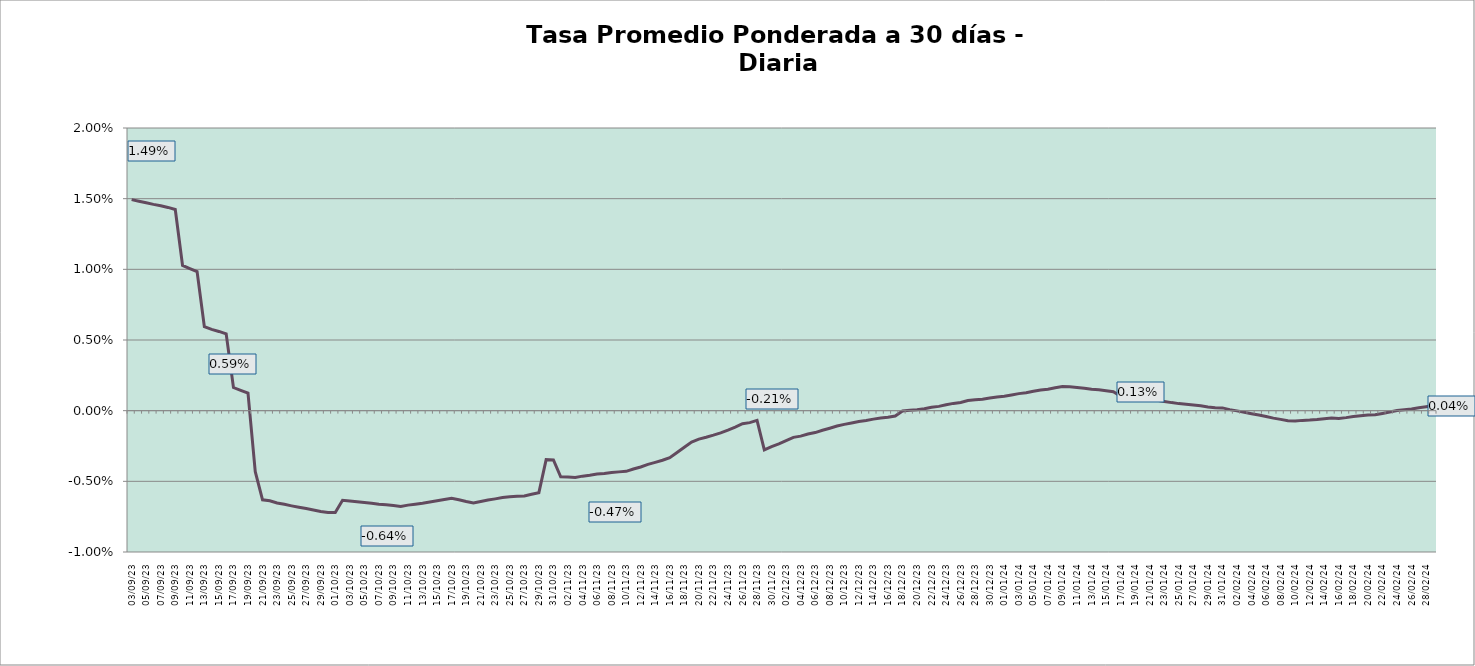
| Category | Tasa a 30 días |
|---|---|
| 2023-09-03 | 0.015 |
| 2023-09-04 | 0.015 |
| 2023-09-05 | 0.015 |
| 2023-09-06 | 0.015 |
| 2023-09-07 | 0.014 |
| 2023-09-08 | 0.014 |
| 2023-09-09 | 0.014 |
| 2023-09-10 | 0.01 |
| 2023-09-11 | 0.01 |
| 2023-09-12 | 0.01 |
| 2023-09-13 | 0.006 |
| 2023-09-14 | 0.006 |
| 2023-09-15 | 0.006 |
| 2023-09-16 | 0.005 |
| 2023-09-17 | 0.002 |
| 2023-09-18 | 0.001 |
| 2023-09-19 | 0.001 |
| 2023-09-20 | -0.004 |
| 2023-09-21 | -0.006 |
| 2023-09-22 | -0.006 |
| 2023-09-23 | -0.007 |
| 2023-09-24 | -0.007 |
| 2023-09-25 | -0.007 |
| 2023-09-26 | -0.007 |
| 2023-09-27 | -0.007 |
| 2023-09-28 | -0.007 |
| 2023-09-29 | -0.007 |
| 2023-09-30 | -0.007 |
| 2023-10-01 | -0.007 |
| 2023-10-02 | -0.006 |
| 2023-10-03 | -0.006 |
| 2023-10-04 | -0.006 |
| 2023-10-05 | -0.006 |
| 2023-10-06 | -0.007 |
| 2023-10-07 | -0.007 |
| 2023-10-08 | -0.007 |
| 2023-10-09 | -0.007 |
| 2023-10-10 | -0.007 |
| 2023-10-11 | -0.007 |
| 2023-10-12 | -0.007 |
| 2023-10-13 | -0.007 |
| 2023-10-14 | -0.006 |
| 2023-10-15 | -0.006 |
| 2023-10-16 | -0.006 |
| 2023-10-17 | -0.006 |
| 2023-10-18 | -0.006 |
| 2023-10-19 | -0.006 |
| 2023-10-20 | -0.007 |
| 2023-10-21 | -0.006 |
| 2023-10-22 | -0.006 |
| 2023-10-23 | -0.006 |
| 2023-10-24 | -0.006 |
| 2023-10-25 | -0.006 |
| 2023-10-26 | -0.006 |
| 2023-10-27 | -0.006 |
| 2023-10-28 | -0.006 |
| 2023-10-29 | -0.006 |
| 2023-10-30 | -0.003 |
| 2023-10-31 | -0.003 |
| 2023-11-01 | -0.005 |
| 2023-11-02 | -0.005 |
| 2023-11-03 | -0.005 |
| 2023-11-04 | -0.005 |
| 2023-11-05 | -0.005 |
| 2023-11-06 | -0.004 |
| 2023-11-07 | -0.004 |
| 2023-11-08 | -0.004 |
| 2023-11-09 | -0.004 |
| 2023-11-10 | -0.004 |
| 2023-11-11 | -0.004 |
| 2023-11-12 | -0.004 |
| 2023-11-13 | -0.004 |
| 2023-11-14 | -0.004 |
| 2023-11-15 | -0.004 |
| 2023-11-16 | -0.003 |
| 2023-11-17 | -0.003 |
| 2023-11-18 | -0.003 |
| 2023-11-19 | -0.002 |
| 2023-11-20 | -0.002 |
| 2023-11-21 | -0.002 |
| 2023-11-22 | -0.002 |
| 2023-11-23 | -0.002 |
| 2023-11-24 | -0.001 |
| 2023-11-25 | -0.001 |
| 2023-11-26 | -0.001 |
| 2023-11-27 | -0.001 |
| 2023-11-28 | -0.001 |
| 2023-11-29 | -0.003 |
| 2023-11-30 | -0.003 |
| 2023-12-01 | -0.002 |
| 2023-12-02 | -0.002 |
| 2023-12-03 | -0.002 |
| 2023-12-04 | -0.002 |
| 2023-12-05 | -0.002 |
| 2023-12-06 | -0.002 |
| 2023-12-07 | -0.001 |
| 2023-12-08 | -0.001 |
| 2023-12-09 | -0.001 |
| 2023-12-10 | -0.001 |
| 2023-12-11 | -0.001 |
| 2023-12-12 | -0.001 |
| 2023-12-13 | -0.001 |
| 2023-12-14 | -0.001 |
| 2023-12-15 | -0.001 |
| 2023-12-16 | 0 |
| 2023-12-17 | 0 |
| 2023-12-18 | 0 |
| 2023-12-19 | 0 |
| 2023-12-20 | 0 |
| 2023-12-21 | 0 |
| 2023-12-22 | 0 |
| 2023-12-23 | 0 |
| 2023-12-24 | 0 |
| 2023-12-25 | 0.001 |
| 2023-12-26 | 0.001 |
| 2023-12-27 | 0.001 |
| 2023-12-28 | 0.001 |
| 2023-12-29 | 0.001 |
| 2023-12-30 | 0.001 |
| 2023-12-31 | 0.001 |
| 2024-01-01 | 0.001 |
| 2024-01-02 | 0.001 |
| 2024-01-03 | 0.001 |
| 2024-01-04 | 0.001 |
| 2024-01-05 | 0.001 |
| 2024-01-06 | 0.001 |
| 2024-01-07 | 0.002 |
| 2024-01-08 | 0.002 |
| 2024-01-09 | 0.002 |
| 2024-01-10 | 0.002 |
| 2024-01-11 | 0.002 |
| 2024-01-12 | 0.002 |
| 2024-01-13 | 0.002 |
| 2024-01-14 | 0.001 |
| 2024-01-15 | 0.001 |
| 2024-01-16 | 0.001 |
| 2024-01-17 | 0.001 |
| 2024-01-18 | 0.001 |
| 2024-01-19 | 0.001 |
| 2024-01-20 | 0.001 |
| 2024-01-21 | 0.001 |
| 2024-01-22 | 0.001 |
| 2024-01-23 | 0.001 |
| 2024-01-24 | 0.001 |
| 2024-01-25 | 0 |
| 2024-01-26 | 0 |
| 2024-01-27 | 0 |
| 2024-01-28 | 0 |
| 2024-01-29 | 0 |
| 2024-01-30 | 0 |
| 2024-01-31 | 0 |
| 2024-02-01 | 0 |
| 2024-02-02 | 0 |
| 2024-02-03 | 0 |
| 2024-02-04 | 0 |
| 2024-02-05 | 0 |
| 2024-02-06 | 0 |
| 2024-02-07 | -0.001 |
| 2024-02-08 | -0.001 |
| 2024-02-09 | -0.001 |
| 2024-02-10 | -0.001 |
| 2024-02-11 | -0.001 |
| 2024-02-12 | -0.001 |
| 2024-02-13 | -0.001 |
| 2024-02-14 | -0.001 |
| 2024-02-15 | -0.001 |
| 2024-02-16 | -0.001 |
| 2024-02-17 | 0 |
| 2024-02-18 | 0 |
| 2024-02-19 | 0 |
| 2024-02-20 | 0 |
| 2024-02-21 | 0 |
| 2024-02-22 | 0 |
| 2024-02-23 | 0 |
| 2024-02-24 | 0 |
| 2024-02-25 | 0 |
| 2024-02-26 | 0 |
| 2024-02-27 | 0 |
| 2024-02-28 | 0 |
| 2024-02-29 | 0 |